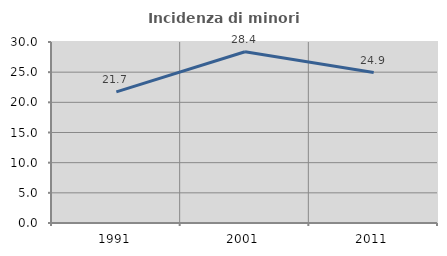
| Category | Incidenza di minori stranieri |
|---|---|
| 1991.0 | 21.739 |
| 2001.0 | 28.387 |
| 2011.0 | 24.932 |